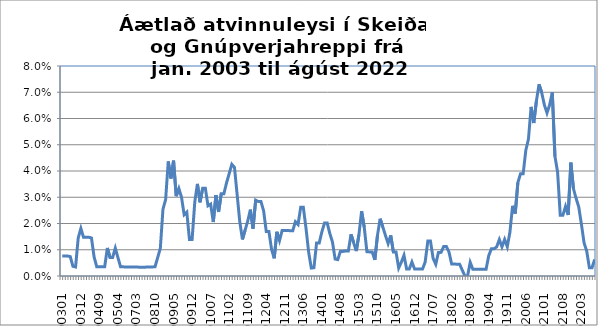
| Category | Series 0 |
|---|---|
| 200301 | 0.008 |
| 200302 | 0.008 |
| 200303 | 0.008 |
| 200304 | 0.007 |
| 200305 | 0.004 |
| 200308 | 0.003 |
| 200311 | 0.014 |
| 200312 | 0.018 |
| 200401 | 0.015 |
| 200402 | 0.015 |
| 200403 | 0.015 |
| 200404 | 0.014 |
| 200405 | 0.007 |
| 200407 | 0.004 |
| 200409 | 0.004 |
| 200410 | 0.004 |
| 200411 | 0.004 |
| 200412 | 0.011 |
| 200501 | 0.007 |
| 200502 | 0.007 |
| 200503 | 0.011 |
| 200504 | 0.007 |
| 200505 | 0.003 |
| 200506 | 0.003 |
| 200611 | 0.003 |
| 200612 | 0.003 |
| 200701 | 0.003 |
| 200702 | 0.003 |
| 200703 | 0.003 |
| 200705 | 0.003 |
| 200706 | 0.003 |
| 200709 | 0.003 |
| 200710 | 0.003 |
| 200711 | 0.003 |
| 200712 | 0.003 |
| 200810 | 0.004 |
| 200811 | 0.007 |
| 200812 | 0.011 |
| 200901 | 0.025 |
| 200902 | 0.029 |
| 200903 | 0.044 |
| 200904 | 0.037 |
| 200905 | 0.044 |
| 200906 | 0.03 |
| 200907 | 0.033 |
| 200908 | 0.03 |
| 200909 | 0.023 |
| 200910 | 0.024 |
| 200911 | 0.014 |
| 200912 | 0.014 |
| 201001 | 0.028 |
| 201002 | 0.035 |
| 201003 | 0.028 |
| 201004 | 0.033 |
| 201005 | 0.033 |
| 201006 | 0.027 |
| 201007 | 0.027 |
| 201008 | 0.021 |
| 201009 | 0.031 |
| 201010 | 0.024 |
| 201011 | 0.031 |
| 201012 | 0.031 |
| 201101 | 0.035 |
| 201102 | 0.039 |
| 201103 | 0.043 |
| 201104 | 0.041 |
| 201105 | 0.031 |
| 201106 | 0.021 |
| 201107 | 0.014 |
| 201108 | 0.017 |
| 201109 | 0.021 |
| 201110 | 0.025 |
| 201111 | 0.018 |
| 201112 | 0.029 |
| 201201 | 0.028 |
| 201202 | 0.028 |
| 201203 | 0.025 |
| 201204 | 0.017 |
| 201205 | 0.017 |
| 201206 | 0.01 |
| 201207 | 0.007 |
| 201208 | 0.017 |
| 201209 | 0.013 |
| 201210 | 0.017 |
| 201211 | 0.017 |
| 201212 | 0.017 |
| 201301 | 0.017 |
| 201302 | 0.017 |
| 201303 | 0.021 |
| 201304 | 0.02 |
| 201305 | 0.026 |
| 201306 | 0.026 |
| 201307 | 0.018 |
| 201308 | 0.009 |
| 201309 | 0.003 |
| 201310 | 0.003 |
| 201311 | 0.013 |
| 201312 | 0.013 |
| 201401 | 0.017 |
| 201402 | 0.02 |
| 201403 | 0.02 |
| 201404 | 0.016 |
| 201405 | 0.013 |
| 201406 | 0.006 |
| 201407 | 0.006 |
| 201408 | 0.009 |
| 201409 | 0.009 |
| 201410 | 0.01 |
| 201411 | 0.01 |
| 201412 | 0.016 |
| 2001501 | 0.013 |
| 201502 | 0.009 |
| 201503 | 0.016 |
| 201504 | 0.025 |
| 201505 | 0.019 |
| 201506 | 0.009 |
| 201507 | 0.009 |
| 201508 | 0.009 |
| 201509 | 0.006 |
| 201510 | 0.016 |
| 201511 | 0.022 |
| 201512 | 0.019 |
| 201601 | 0.015 |
| 201602 | 0.012 |
| 201603 | 0.015 |
| 201604 | 0.009 |
| 201605 | 0.009 |
| 201606 | 0.003 |
| 201607 | 0.005 |
| 201608 | 0.008 |
| 201609 | 0.003 |
| 201610 | 0.003 |
| 201611 | 0.005 |
| 201612 | 0.003 |
| 201701 | 0.003 |
| 201702 | 0.003 |
| 201703 | 0.003 |
| 201704 | 0.005 |
| 201705 | 0.013 |
| 201706 | 0.013 |
| 201707 | 0.007 |
| 201708 | 0.004 |
| 201709 | 0.009 |
| 201710 | 0.009 |
| 201711 | 0.011 |
| 201712 | 0.011 |
| 201801 | 0.009 |
| 201802 | 0.005 |
| 201803 | 0.005 |
| 201804 | 0.004 |
| 201805 | 0.004 |
| 201806 | 0.002 |
| 201807 | 0 |
| 201808 | 0 |
| 201809 | 0.005 |
| 201810 | 0.003 |
| 201811 | 0.003 |
| 201812 | 0.003 |
| 201901 | 0.003 |
| 201902 | 0.003 |
| 201903 | 0.003 |
| 201904 | 0.008 |
| 201905 | 0.01 |
| 201906 | 0.01 |
| 201907 | 0.011 |
| 201908 | 0.014 |
| 201909 | 0.011 |
| 201910 | 0.014 |
| 201911 | 0.011 |
| 201912 | 0.017 |
| 202001 | 0.027 |
| 202002 | 0.024 |
| 202003 | 0.036 |
| 202004 | 0.039 |
| 202005 | 0.039 |
| 202006 | 0.048 |
| 202007 | 0.052 |
| 202008 | 0.064 |
| 202009 | 0.058 |
| 202010 | 0.067 |
| 202011 | 0.073 |
| 202012 | 0.07 |
| 202101 | 0.065 |
| 202102 | 0.062 |
| 202103 | 0.065 |
| 202104 | 0.07 |
| 202105 | 0.046 |
| 202106 | 0.04 |
| 202107 | 0.023 |
| 202108 | 0.023 |
| 202109 | 0.026 |
| 202110 | 0.023 |
| 202111 | 0.043 |
| 202112 | 0.033 |
| 202201 | 0.03 |
| 202202 | 0.026 |
| 202203 | 0.02 |
| 202204 | 0.013 |
| 202205 | 0.009 |
| 202206 | 0.003 |
| 202207 | 0.003 |
| 202208 | 0.006 |